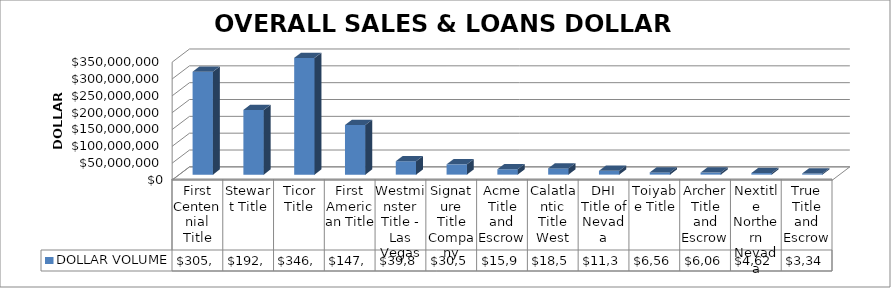
| Category | DOLLAR VOLUME |
|---|---|
| First Centennial Title | 305749639.79 |
| Stewart Title | 192224677 |
| Ticor Title | 346656384.79 |
| First American Title | 147408284.77 |
| Westminster Title - Las Vegas | 39814631 |
| Signature Title Company | 30552125 |
| Acme Title and Escrow | 15903065 |
| Calatlantic Title West | 18543136 |
| DHI Title of Nevada | 11339490 |
| Toiyabe Title | 6568132 |
| Archer Title and Escrow | 6065500 |
| Nextitle Northern Nevada | 4627755 |
| True Title and Escrow | 3347377 |